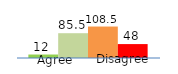
| Category | Series 0 | Series 1 | Series 2 | Series 3 |
|---|---|---|---|---|
| 0 | 12 | 85.5 | 108.5 | 48 |